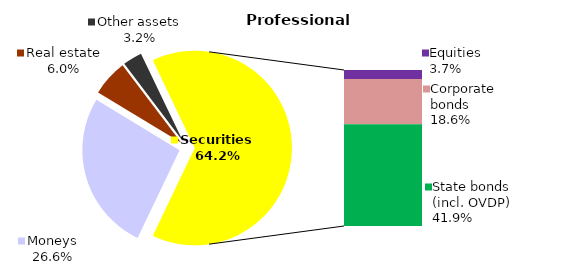
| Category | Professional |
|---|---|
| Moneys | 31.175 |
| Bank metals | 0 |
| Real estate | 7.062 |
| Other assets | 3.764 |
| Equities | 4.36 |
| Corporate bonds | 21.875 |
| Municipal bonds | 0 |
| State bonds (incl. OVDP) | 49.129 |